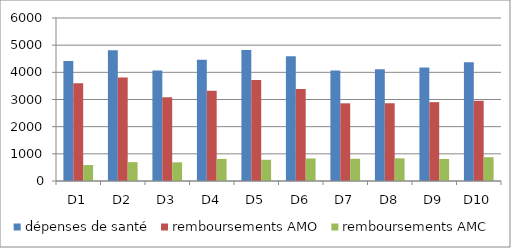
| Category | dépenses de santé | remboursements AMO | remboursements AMC |
|---|---|---|---|
| D1 | 4420.97 | 3593.75 | 587.57 |
| D2 | 4814.55 | 3809.58 | 693.69 |
| D3 | 4071.52 | 3081.89 | 686.91 |
| D4 | 4465.52 | 3318.9 | 811.94 |
| D5 | 4819.91 | 3717.25 | 780.86 |
| D6 | 4595.22 | 3388.71 | 829.11 |
| D7 | 4065.07 | 2859.41 | 818.63 |
| D8 | 4110.62 | 2861.86 | 834.78 |
| D9 | 4179.62 | 2902.65 | 809.4 |
| D10 | 4368.46 | 2951.99 | 874.71 |